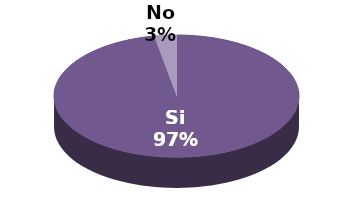
| Category | Series 1 |
|---|---|
| Si | 33 |
| No | 1 |